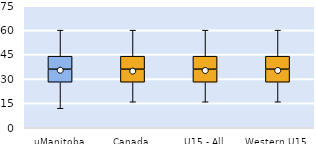
| Category | 25th | 50th | 75th |
|---|---|---|---|
| uManitoba | 28 | 8 | 8 |
| Canada | 28 | 8 | 8 |
| U15 - All | 28 | 8 | 8 |
| Western U15 | 28 | 8 | 8 |